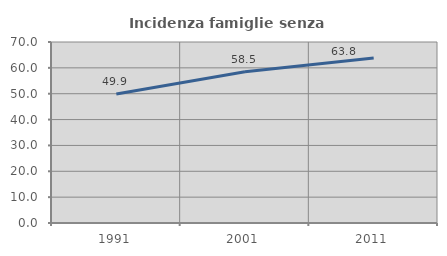
| Category | Incidenza famiglie senza nuclei |
|---|---|
| 1991.0 | 49.882 |
| 2001.0 | 58.486 |
| 2011.0 | 63.768 |